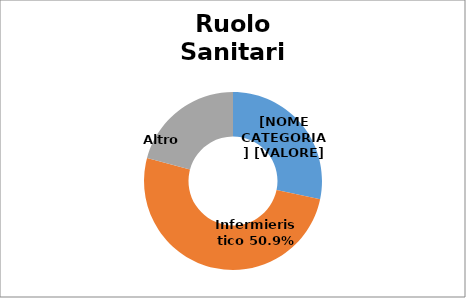
| Category | Series 0 |
|---|---|
| Medici e Odontoiatri | 0.283 |
| Infermieristico | 0.509 |
| Altro  | 0.208 |